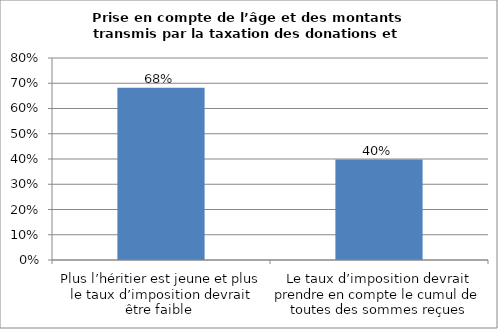
| Category | Ensemble |
|---|---|
| Plus l’héritier est jeune et plus le taux d’imposition devrait être faible  | 0.682 |
| Le taux d’imposition devrait prendre en compte le cumul de toutes des sommes reçues | 0.398 |